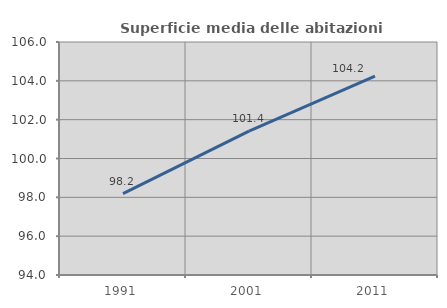
| Category | Superficie media delle abitazioni occupate |
|---|---|
| 1991.0 | 98.196 |
| 2001.0 | 101.407 |
| 2011.0 | 104.239 |